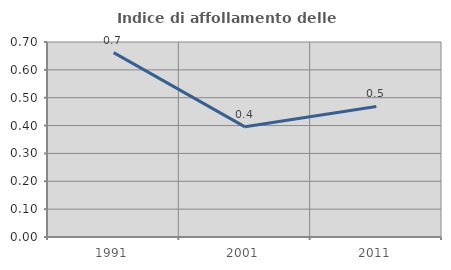
| Category | Indice di affollamento delle abitazioni  |
|---|---|
| 1991.0 | 0.662 |
| 2001.0 | 0.395 |
| 2011.0 | 0.469 |